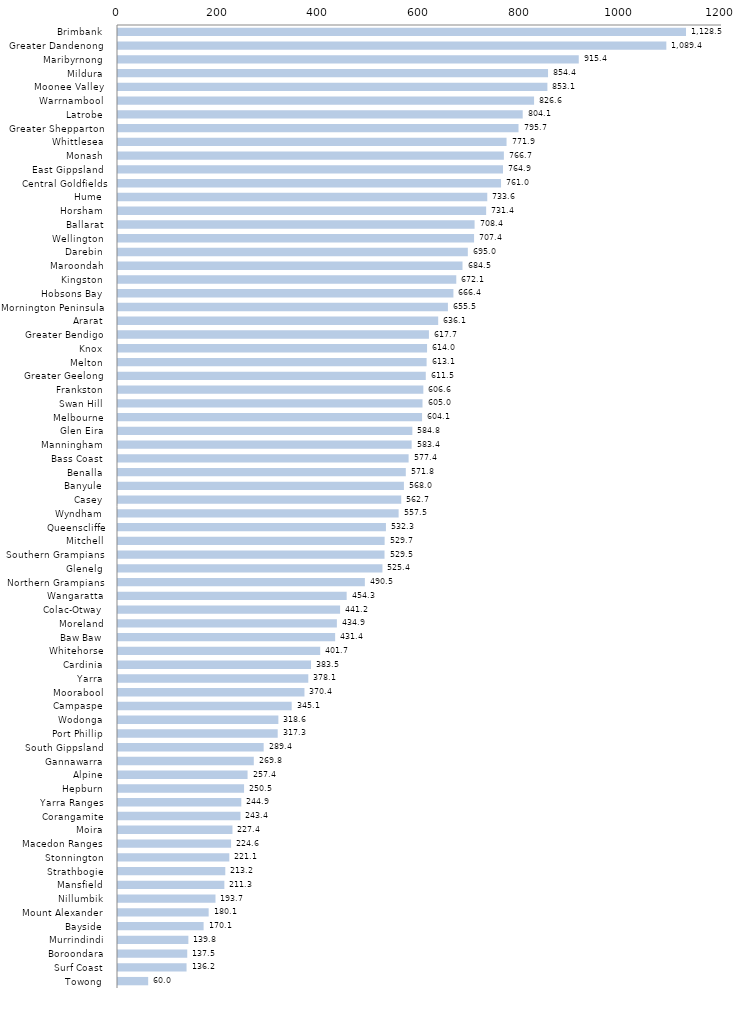
| Category | Series 0 |
|---|---|
| Brimbank  | 1128.506 |
| Greater Dandenong  | 1089.399 |
| Maribyrnong  | 915.397 |
| Mildura  | 854.375 |
| Moonee Valley  | 853.097 |
| Warrnambool  | 826.647 |
| Latrobe  | 804.058 |
| Greater Shepparton  | 795.698 |
| Whittlesea  | 771.942 |
| Monash  | 766.653 |
| East Gippsland  | 764.88 |
| Central Goldfields | 760.994 |
| Hume  | 733.628 |
| Horsham  | 731.427 |
| Ballarat  | 708.448 |
| Wellington  | 707.421 |
| Darebin  | 694.995 |
| Maroondah  | 684.456 |
| Kingston  | 672.063 |
| Hobsons Bay  | 666.37 |
| Mornington Peninsula  | 655.464 |
| Ararat  | 636.122 |
| Greater Bendigo  | 617.738 |
| Knox  | 614.027 |
| Melton  | 613.124 |
| Greater Geelong  | 611.47 |
| Frankston  | 606.625 |
| Swan Hill  | 604.967 |
| Melbourne  | 604.066 |
| Glen Eira  | 584.776 |
| Manningham  | 583.403 |
| Bass Coast  | 577.355 |
| Benalla  | 571.782 |
| Banyule  | 568.036 |
| Casey  | 562.711 |
| Wyndham  | 557.522 |
| Queenscliffe | 532.316 |
| Mitchell  | 529.721 |
| Southern Grampians  | 529.505 |
| Glenelg  | 525.371 |
| Northern Grampians  | 490.457 |
| Wangaratta  | 454.306 |
| Colac-Otway  | 441.196 |
| Moreland  | 434.858 |
| Baw Baw  | 431.391 |
| Whitehorse  | 401.675 |
| Cardinia  | 383.465 |
| Yarra  | 378.051 |
| Moorabool  | 370.445 |
| Campaspe  | 345.063 |
| Wodonga  | 318.588 |
| Port Phillip  | 317.277 |
| South Gippsland  | 289.383 |
| Gannawarra  | 269.793 |
| Alpine  | 257.414 |
| Hepburn  | 250.471 |
| Yarra Ranges  | 244.947 |
| Corangamite  | 243.362 |
| Moira  | 227.399 |
| Macedon Ranges  | 224.647 |
| Stonnington  | 221.137 |
| Strathbogie  | 213.152 |
| Mansfield  | 211.309 |
| Nillumbik  | 193.679 |
| Mount Alexander  | 180.111 |
| Bayside  | 170.074 |
| Murrindindi  | 139.785 |
| Boroondara  | 137.548 |
| Surf Coast  | 136.184 |
| Towong  | 59.959 |